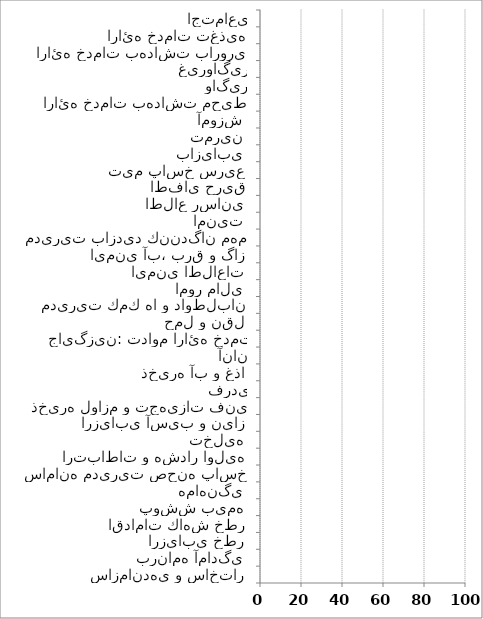
| Category | Series 0 |
|---|---|
| سازماندهي و ساختار | 0 |
| برنامه آمادگي | 0 |
| ارزيابي خطر | 0 |
| اقدامات كاهش خطر | 0 |
| پوشش بيمه | 0 |
| هماهنگي | 0 |
| سامانه مديريت صحنه پاسخ | 0 |
| ارتباطات و هشدار اوليه | 0 |
| تخليه | 0 |
| ارزيابي آسيب و نياز | 0 |
| ذخيره لوازم و تجهيزات فني | 0 |
| ذخيره لوازم و تجهيزات حفاظت فردي | 0 |
| ذخيره آب و غذا | 0 |
| سلامت روان كاركنان و خانواده آنان | 0 |
| نيروي انساني و فضاي جايگزين: تداوم ارائه خدمت | 0 |
| حمل و نقل | 0 |
| مديريت كمك ها و داوطلبان | 0 |
| امور مالي | 0 |
| ايمني اطلاعات | 0 |
| ايمني آب، برق و گاز | 0 |
| مديريت بازديد كنندگان مهم | 0 |
| امنيت | 0 |
| اطلاع رساني | 0 |
| اطفاي حريق | 0 |
| تيم پاسخ سريع | 0 |
| بازيابي | 0 |
| تمرين | 0 |
| آموزش | 0 |
| ارائه خدمات بهداشت محيط | 0 |
| ارائه خدمات مديريت بيماريهاي واگير | 0 |
| ارائه خدمات مديريت بيماريهاي غيرواگير | 0 |
| ارائه خدمات بهداشت باروري | 0 |
| ارائه خدمات تغذيه | 0 |
| ارائه خدمات سلامت رواني- اجتماعي | 0 |